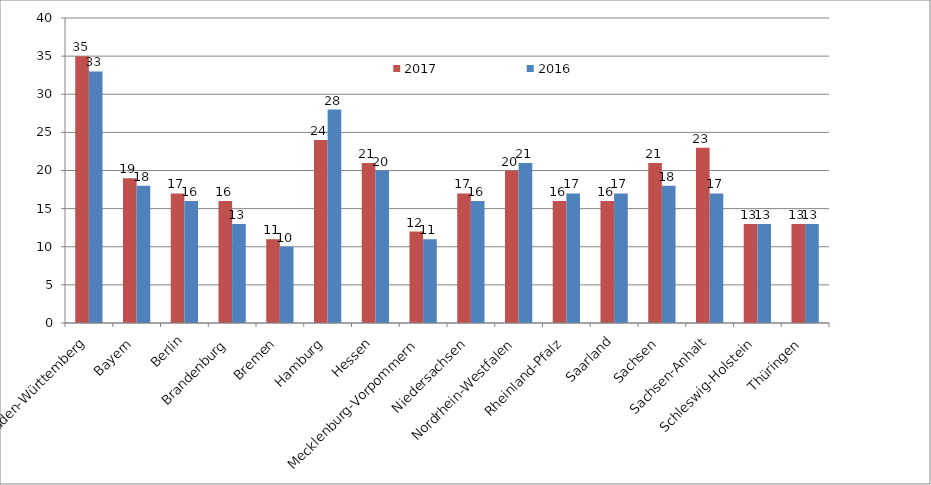
| Category | 2017 | 2016 |
|---|---|---|
| Baden-Württemberg | 35 | 33 |
| Bayern | 19 | 18 |
| Berlin | 17 | 16 |
| Brandenburg | 16 | 13 |
| Bremen | 11 | 10 |
| Hamburg | 24 | 28 |
| Hessen | 21 | 20 |
| Mecklenburg-Vorpommern | 12 | 11 |
| Niedersachsen | 17 | 16 |
| Nordrhein-Westfalen | 20 | 21 |
| Rheinland-Pfalz | 16 | 17 |
| Saarland | 16 | 17 |
| Sachsen | 21 | 18 |
| Sachsen-Anhalt | 23 | 17 |
| Schleswig-Holstein | 13 | 13 |
| Thüringen | 13 | 13 |